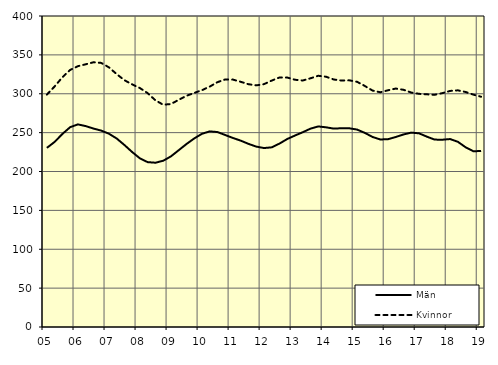
| Category | Män | Kvinnor |
|---|---|---|
| 5.0 | 230.38 | 298.92 |
| nan | 238.07 | 309.39 |
| 6.0 | 248.29 | 321.23 |
| 6.0 | 257 | 330.59 |
| 6.0 | 260.6 | 335.44 |
| nan | 258.42 | 337.89 |
| 7.0 | 255.26 | 340.48 |
| 7.0 | 252.61 | 339.7 |
| 7.0 | 248.6 | 333.97 |
| nan | 242.45 | 325.26 |
| 8.0 | 234.06 | 317.43 |
| 8.0 | 225.03 | 312.04 |
| 8.0 | 216.86 | 307.31 |
| nan | 212.04 | 300.73 |
| 9.0 | 211.3 | 291.56 |
| 9.0 | 213.82 | 285.88 |
| 9.0 | 219.46 | 286.8 |
| nan | 227.36 | 292.15 |
| 10.0 | 235.31 | 297.35 |
| 10.0 | 242.51 | 301.05 |
| 10.0 | 248.49 | 304.58 |
| nan | 251.6 | 309.19 |
| 11.0 | 250.74 | 314.9 |
| 11.0 | 246.92 | 318.4 |
| 11.0 | 243.09 | 318.19 |
| nan | 239.69 | 315.36 |
| 12.0 | 235.55 | 312.26 |
| 12.0 | 232.03 | 310.78 |
| 12.0 | 230.16 | 312.37 |
| nan | 231.08 | 316.95 |
| 13.0 | 235.92 | 320.94 |
| 13.0 | 241.8 | 320.85 |
| 13.0 | 246.3 | 318 |
| nan | 250.54 | 317.03 |
| 14.0 | 255.14 | 319.88 |
| 14.0 | 257.97 | 323.13 |
| 14.0 | 256.83 | 321.91 |
| nan | 255.17 | 318.32 |
| 15.0 | 255.65 | 316.98 |
| 15.0 | 255.6 | 317.25 |
| 15.0 | 253.93 | 315.39 |
| nan | 249.7 | 310.01 |
| 16.0 | 244.4 | 304.06 |
| 16.0 | 241.19 | 301.91 |
| 16.0 | 241.57 | 304.47 |
| nan | 244.4 | 306.69 |
| 17.0 | 247.66 | 305.08 |
| 17.0 | 250.01 | 301.5 |
| 17.0 | 249.06 | 299.9 |
| nan | 244.83 | 299.26 |
| 18.0 | 241.04 | 298.69 |
| 18.0 | 240.88 | 300.77 |
| 18.0 | 241.74 | 303.63 |
| nan | 238.2 | 304.39 |
| 19.0 | 231.16 | 302.26 |
| 19.0 | 226.04 | 298.86 |
| 19.0 | 226.37 | 296.16 |